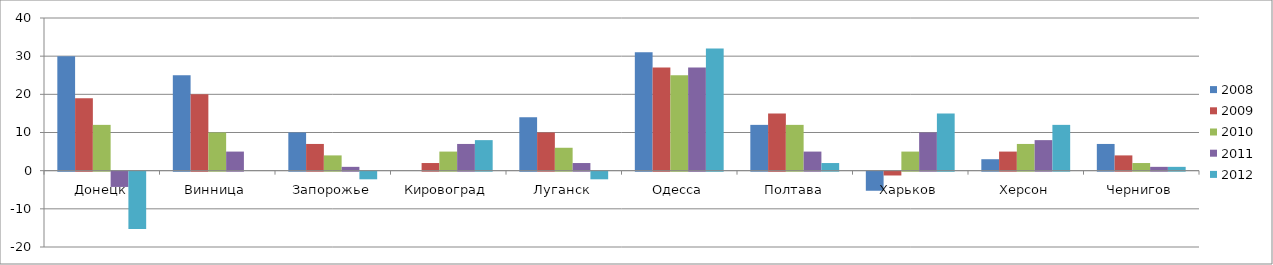
| Category | 2008 | 2009 | 2010 | 2011 | 2012 |
|---|---|---|---|---|---|
| Донецк | 30 | 19 | 12 | -4 | -15 |
| Винница | 25 | 20 | 10 | 5 | 0 |
| Запорожье | 10 | 7 | 4 | 1 | -2 |
| Кировоград | 0 | 2 | 5 | 7 | 8 |
| Луганск | 14 | 10 | 6 | 2 | -2 |
| Одесса | 31 | 27 | 25 | 27 | 32 |
| Полтава | 12 | 15 | 12 | 5 | 2 |
| Харьков | -5 | -1 | 5 | 10 | 15 |
| Херсон | 3 | 5 | 7 | 8 | 12 |
| Чернигов | 7 | 4 | 2 | 1 | 1 |